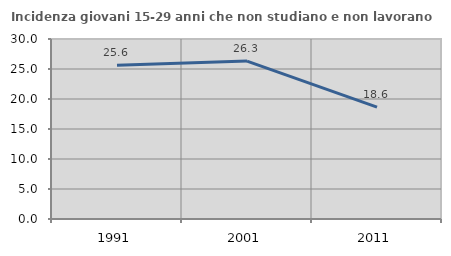
| Category | Incidenza giovani 15-29 anni che non studiano e non lavorano  |
|---|---|
| 1991.0 | 25.628 |
| 2001.0 | 26.316 |
| 2011.0 | 18.644 |